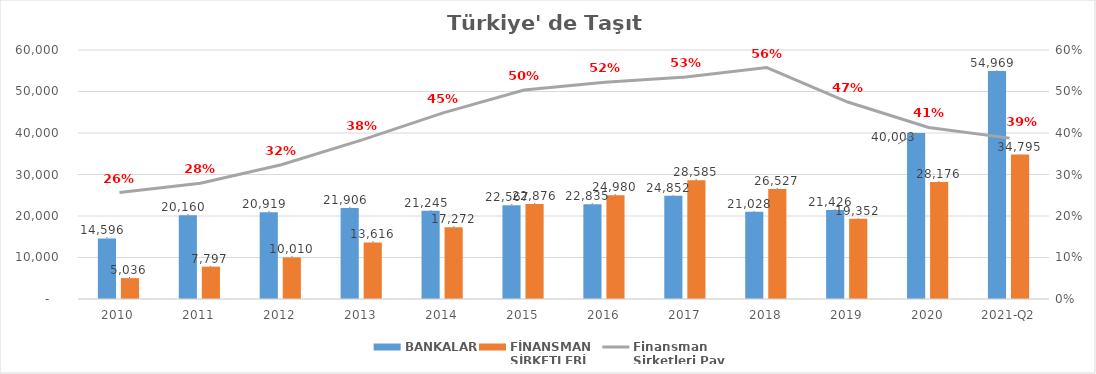
| Category | BANKALAR | FİNANSMAN 
ŞİRKETLERİ |
|---|---|---|
| 2010 | 14596 | 5035.89 |
| 2011 | 20160 | 7796.854 |
| 2012 | 20919 | 10009.755 |
| 2013 | 21906 | 13616.036 |
| 2014 | 21245 | 17271.844 |
| 2015 | 22567 | 22875.563 |
| 2016 | 22835 | 24980.231 |
| 2017 | 24852 | 28584.938 |
| 2018 | 21028 | 26527.133 |
| 2019 | 21426.2 | 19352.327 |
| 2020 | 40002.96 | 28176.3 |
| 2021-Q2 | 54969.15 | 34795.249 |